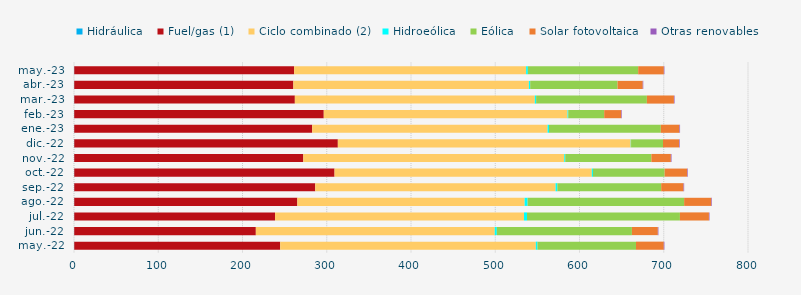
| Category | Hidráulica | Fuel/gas (1) | Ciclo combinado (2) | Hidroeólica | Eólica | Solar fotovoltaica | Otras renovables |
|---|---|---|---|---|---|---|---|
| may.-22 | 0.299 | 244.426 | 303.457 | 1.917 | 116.966 | 32.972 | 0.721 |
| jun.-22 | 0.281 | 215.547 | 283.584 | 2.45 | 160.357 | 30.752 | 0.696 |
| jul.-22 | 0.294 | 238.315 | 295.517 | 3.563 | 181.499 | 34.435 | 0.688 |
| ago.-22 | 0.293 | 264.802 | 269.791 | 3.518 | 185.783 | 32.263 | 0.715 |
| sep.-22 | 0.289 | 286.046 | 285.298 | 2.075 | 123.261 | 26.539 | 0.715 |
| oct.-22 | 0.294 | 308.951 | 305.386 | 1.35 | 85.079 | 26.753 | 0.731 |
| nov.-22 | 0.277 | 271.883 | 309.743 | 1.169 | 102.221 | 23.169 | 0.765 |
| dic.-22 | 0.289 | 312.877 | 347.662 | 0.367 | 37.913 | 19.007 | 0.785 |
| ene.-23 | 0.275 | 282.444 | 279.419 | 1.65 | 132.728 | 22.065 | 0.784 |
| feb.-23 | 0.254 | 296.204 | 289.333 | 0.829 | 42.685 | 20.223 | 0.711 |
| mar.-23 | 0.29 | 261.841 | 284.831 | 1.572 | 131.438 | 32.126 | 0.738 |
| abr.-23 | 0.276 | 260.1 | 279.544 | 1.573 | 103.685 | 29.89 | 0.631 |
| may.-23 | 0.298 | 261.008 | 275.341 | 2.067 | 130.95 | 30.463 | 0.651 |